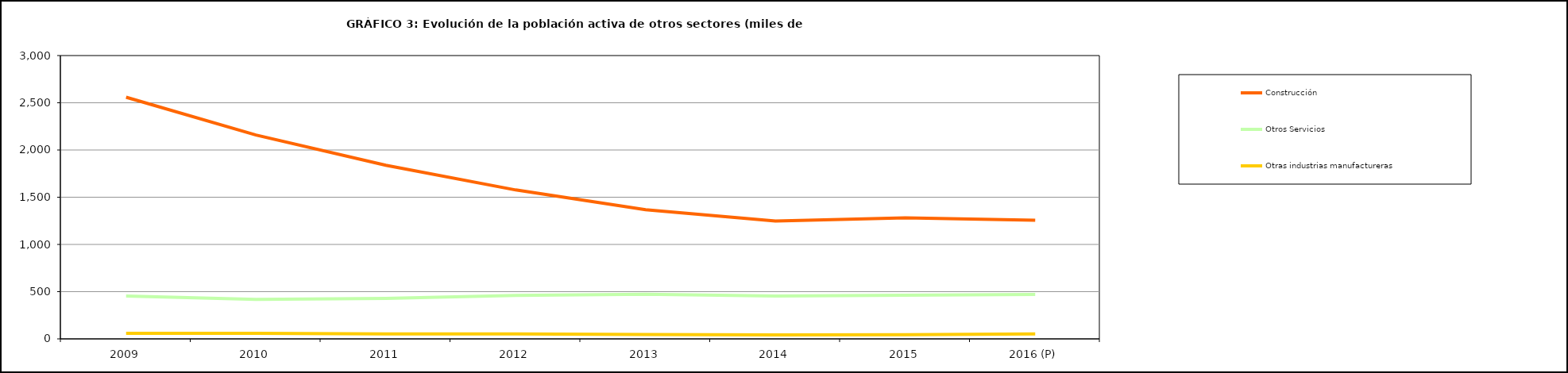
| Category | Construcción | Otros Servicios | Otras industrias manufactureras |
|---|---|---|---|
| 2009 | 2558.825 | 453.325 | 59.2 |
| 2010 | 2158.15 | 418.775 | 58.075 |
| 2011 | 1837.95 | 428.625 | 52.3 |
| 2012 | 1576.925 | 459.15 | 52.8 |
| 2013 | 1366.878 | 473.15 | 46.85 |
| 2014 | 1247.2 | 454.2 | 42.2 |
| 2015 | 1280.975 | 462.325 | 44.95 |
| 2016 (P) | 1256.45 | 471.23 | 52.98 |